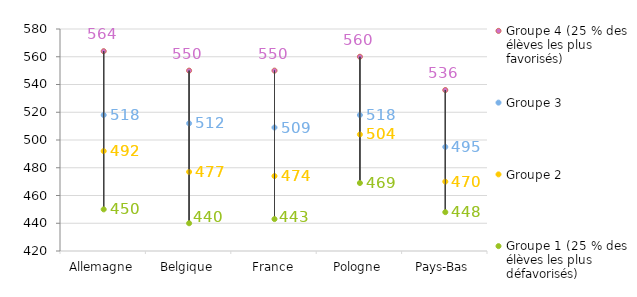
| Category | Groupe 4 (25 % des élèves les plus favorisés) | Groupe 3 | Groupe 2 | Groupe 1 (25 % des élèves les plus défavorisés) |
|---|---|---|---|---|
| Allemagne | 564 | 518 | 492 | 450 |
| Belgique | 550 | 512 | 477 | 440 |
| France | 550 | 509 | 474 | 443 |
| Pologne | 560 | 518 | 504 | 469 |
| Pays-Bas | 536 | 495 | 470 | 448 |